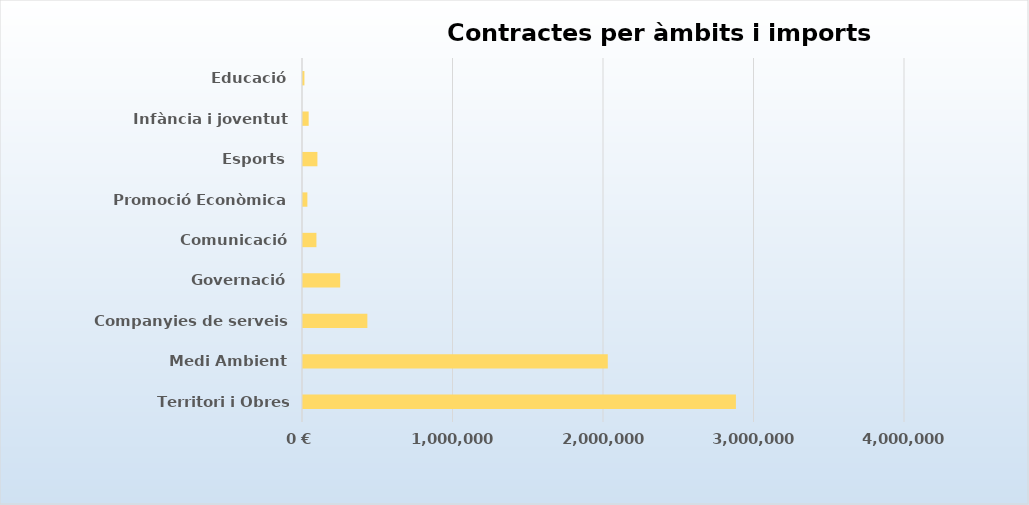
| Category | Import IVA exclòs |
|---|---|
| Territori i Obres públiques | 2876475.45 |
| Medi Ambient | 2025060.85 |
| Companyies de serveis | 427669.37 |
| Governació | 246997.99 |
| Comunicació | 89194.4 |
| Promoció Econòmica | 29100 |
| Esports | 95735.28 |
| Infància i joventut | 37620 |
| Educació | 9450 |